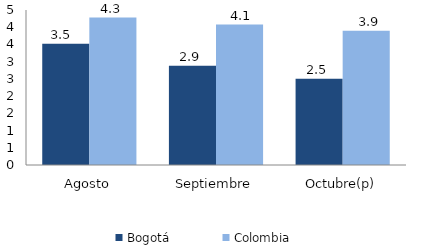
| Category | Bogotá | Colombia |
|---|---|---|
| Agosto | 3.517 | 4.282 |
| Septiembre | 2.884 | 4.079 |
| Octubre(p) | 2.501 | 3.9 |